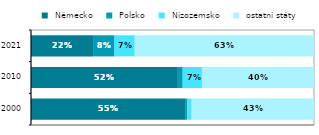
| Category |  Německo |  Polsko |  Nizozemsko |  ostatní státy |
|---|---|---|---|---|
| 2000.0 | 0.547 | 0.005 | 0.016 | 0.433 |
| 2010.0 | 0.519 | 0.017 | 0.068 | 0.396 |
| 2021.0 | 0.219 | 0.076 | 0.072 | 0.633 |